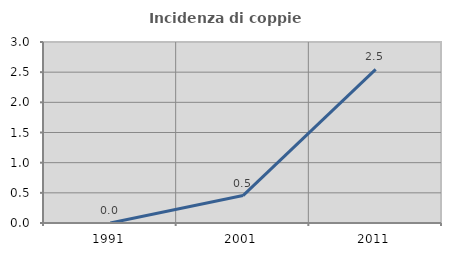
| Category | Incidenza di coppie miste |
|---|---|
| 1991.0 | 0 |
| 2001.0 | 0.455 |
| 2011.0 | 2.546 |